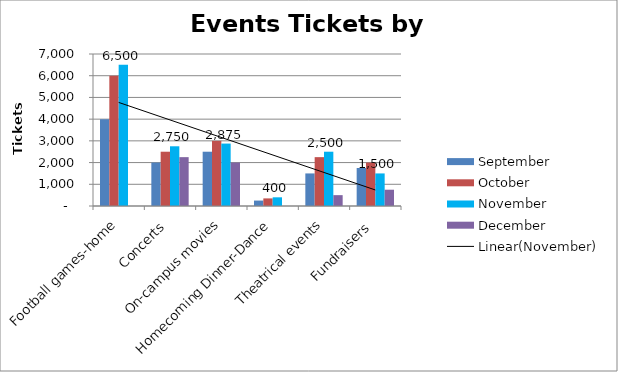
| Category | September | October | November | December |
|---|---|---|---|---|
| Football games-home | 4000 | 6000 | 6500 | 0 |
| Concerts | 2000 | 2500 | 2750 | 2250 |
| On-campus movies | 2500 | 3000 | 2875 | 2000 |
| Homecoming Dinner-Dance | 250 | 350 | 400 | 0 |
| Theatrical events | 1500 | 2250 | 2500 | 500 |
| Fundraisers | 1750 | 2000 | 1500 | 750 |